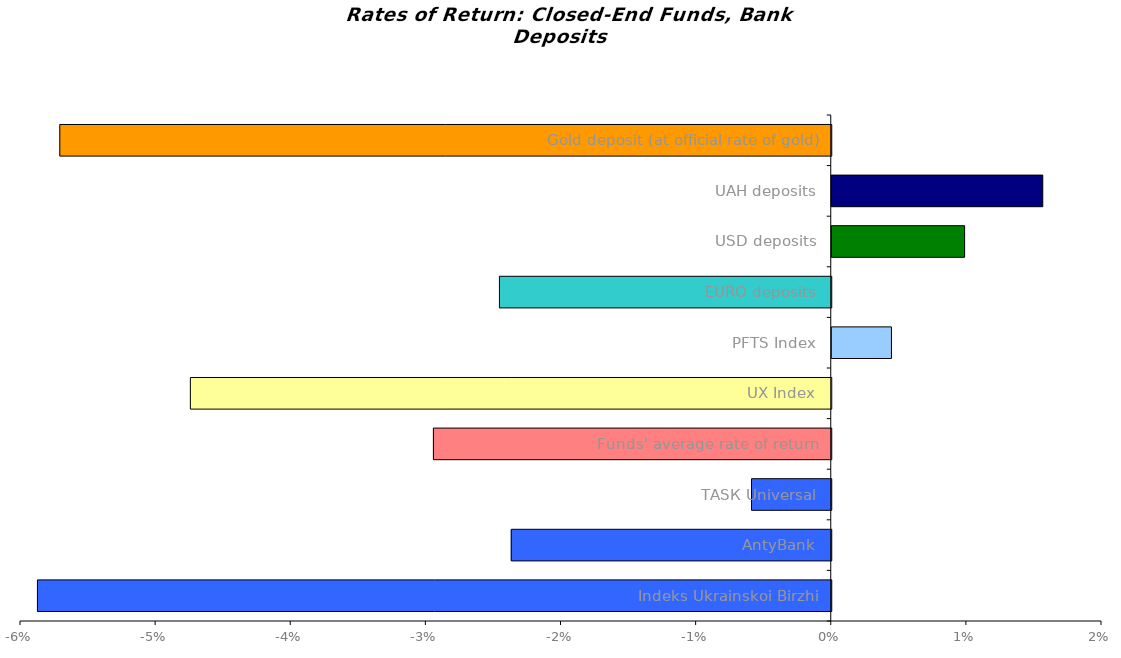
| Category | Series 0 |
|---|---|
| Indeks Ukrainskoi Birzhi | -0.059 |
| AntyBank | -0.024 |
| ТАSК Universal | -0.006 |
| Funds' average rate of return | -0.029 |
| UX Index | -0.047 |
| PFTS Index | 0.004 |
| EURO deposits | -0.025 |
| USD deposits | 0.01 |
| UAH deposits | 0.016 |
| Gold deposit (at official rate of gold) | -0.057 |